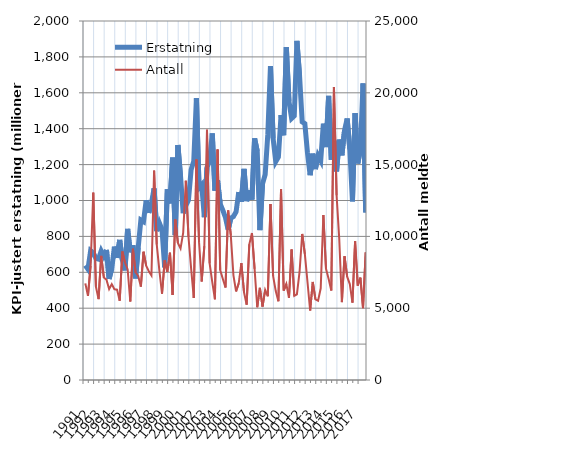
| Category | Erstatning |
|---|---|
| 1991.0 | 638.305 |
| nan | 617.49 |
| nan | 720.489 |
| nan | 708.243 |
| 1992.0 | 677.664 |
| nan | 673.336 |
| nan | 718.939 |
| nan | 690.111 |
| 1993.0 | 724.645 |
| nan | 562.774 |
| nan | 620.914 |
| nan | 743.095 |
| 1994.0 | 680.401 |
| nan | 780.53 |
| nan | 668.973 |
| nan | 610.787 |
| 1995.0 | 841.824 |
| nan | 711.536 |
| nan | 750.775 |
| nan | 566.189 |
| 1996.0 | 737.681 |
| nan | 891.182 |
| nan | 882.294 |
| nan | 1001.12 |
| 1997.0 | 931.155 |
| nan | 984.699 |
| nan | 1067.548 |
| nan | 829.951 |
| 1998.0 | 874.341 |
| nan | 837.865 |
| nan | 627.95 |
| nan | 1062.058 |
| 1999.0 | 984.04 |
| nan | 1239.159 |
| nan | 807.292 |
| nan | 1308.796 |
| 2000.0 | 1135.005 |
| nan | 928.869 |
| nan | 971.109 |
| nan | 1002.211 |
| 2001.0 | 1171.491 |
| nan | 1219.438 |
| nan | 1570.162 |
| nan | 1070.081 |
| 2002.0 | 1086.861 |
| nan | 907.106 |
| nan | 1183.634 |
| nan | 1224.277 |
| 2003.0 | 1373.705 |
| nan | 1054.474 |
| nan | 1113.11 |
| nan | 980.293 |
| 2004.0 | 945.444 |
| nan | 904.425 |
| nan | 836.38 |
| nan | 901.062 |
| 2005.0 | 910.826 |
| nan | 937.052 |
| nan | 1046.812 |
| nan | 993.378 |
| 2006.0 | 1176.283 |
| nan | 996.283 |
| nan | 1056.559 |
| nan | 1005.082 |
| 2007.0 | 1345.962 |
| nan | 1275.048 |
| nan | 835.366 |
| nan | 1092.832 |
| 2008.0 | 1144.621 |
| nan | 1369.428 |
| nan | 1748.539 |
| nan | 1346.977 |
| 2009.0 | 1216.204 |
| nan | 1241.686 |
| nan | 1475.828 |
| nan | 1363.591 |
| 2010.0 | 1854.723 |
| nan | 1552.135 |
| nan | 1457.291 |
| nan | 1471.348 |
| 2011.0 | 1889.184 |
| nan | 1694.934 |
| nan | 1438.377 |
| nan | 1427.875 |
| 2012.0 | 1264.734 |
| nan | 1141.025 |
| nan | 1260.942 |
| nan | 1174.868 |
| 2013.0 | 1250.053 |
| nan | 1222.343 |
| nan | 1427.919 |
| nan | 1297.809 |
| 2014.0 | 1583.326 |
| nan | 1227.429 |
| nan | 1331.604 |
| nan | 1162.233 |
| 2015.0 | 1339.019 |
| nan | 1251.691 |
| nan | 1390.064 |
| nan | 1456.52 |
| 2016.0 | 1285.825 |
| nan | 994.954 |
| nan | 1487.318 |
| nan | 1206.287 |
| 2017.0 | 1282.089 |
| nan | 1652.148 |
| nan | 933.626 |